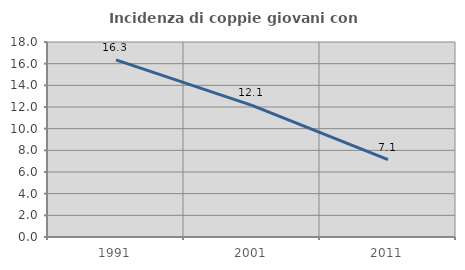
| Category | Incidenza di coppie giovani con figli |
|---|---|
| 1991.0 | 16.344 |
| 2001.0 | 12.146 |
| 2011.0 | 7.135 |